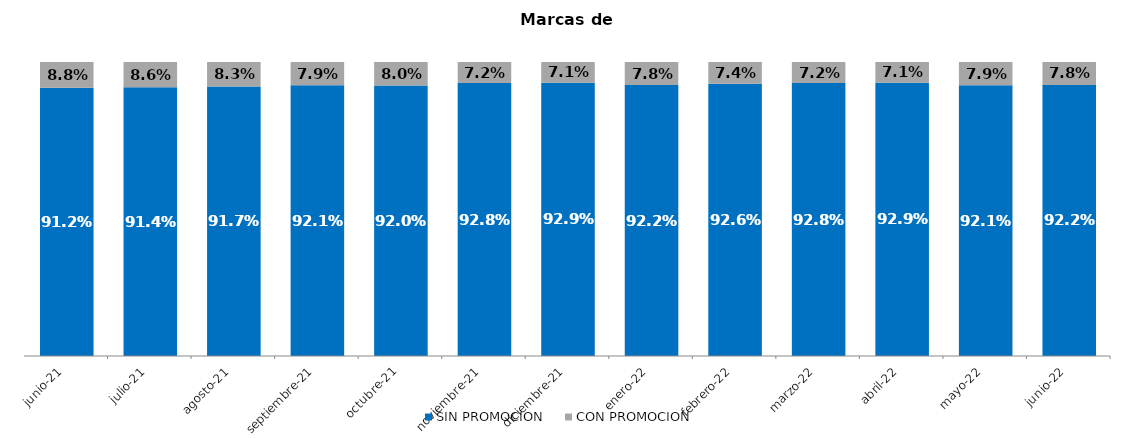
| Category | SIN PROMOCION   | CON PROMOCION   |
|---|---|---|
| 2021-06-01 | 0.912 | 0.088 |
| 2021-07-01 | 0.914 | 0.086 |
| 2021-08-01 | 0.917 | 0.083 |
| 2021-09-01 | 0.921 | 0.079 |
| 2021-10-01 | 0.92 | 0.08 |
| 2021-11-01 | 0.928 | 0.072 |
| 2021-12-01 | 0.929 | 0.071 |
| 2022-01-01 | 0.922 | 0.078 |
| 2022-02-01 | 0.926 | 0.074 |
| 2022-03-01 | 0.928 | 0.072 |
| 2022-04-01 | 0.929 | 0.071 |
| 2022-05-01 | 0.921 | 0.079 |
| 2022-06-01 | 0.922 | 0.078 |